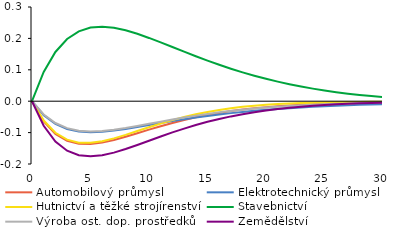
| Category | Automobilový průmysl | Elektrotechnický průmysl | Hutnictví a těžké strojírenství | Stavebnictví | Výroba ost. dop. prostředků | Zemědělství |
|---|---|---|---|---|---|---|
| 0.0 | 0 | 0 | 0 | 0 | 0 | 0 |
| 1.0 | -0.064 | -0.044 | -0.062 | 0.093 | -0.042 | -0.078 |
| 2.0 | -0.104 | -0.072 | -0.101 | 0.157 | -0.07 | -0.128 |
| 3.0 | -0.126 | -0.088 | -0.122 | 0.198 | -0.086 | -0.158 |
| 4.0 | -0.136 | -0.096 | -0.132 | 0.222 | -0.094 | -0.172 |
| 5.0 | -0.137 | -0.099 | -0.133 | 0.234 | -0.096 | -0.176 |
| 6.0 | -0.132 | -0.097 | -0.127 | 0.237 | -0.095 | -0.172 |
| 7.0 | -0.124 | -0.094 | -0.118 | 0.234 | -0.091 | -0.164 |
| 8.0 | -0.113 | -0.088 | -0.107 | 0.226 | -0.085 | -0.152 |
| 9.0 | -0.102 | -0.082 | -0.095 | 0.215 | -0.079 | -0.14 |
| 10.0 | -0.091 | -0.076 | -0.083 | 0.201 | -0.072 | -0.126 |
| 11.0 | -0.08 | -0.069 | -0.071 | 0.187 | -0.065 | -0.112 |
| 12.0 | -0.069 | -0.063 | -0.06 | 0.172 | -0.058 | -0.099 |
| 13.0 | -0.06 | -0.057 | -0.05 | 0.158 | -0.052 | -0.087 |
| 14.0 | -0.051 | -0.052 | -0.042 | 0.143 | -0.046 | -0.076 |
| 15.0 | -0.044 | -0.047 | -0.034 | 0.129 | -0.04 | -0.066 |
| 16.0 | -0.037 | -0.042 | -0.028 | 0.116 | -0.035 | -0.057 |
| 17.0 | -0.032 | -0.038 | -0.022 | 0.104 | -0.031 | -0.048 |
| 18.0 | -0.027 | -0.034 | -0.018 | 0.092 | -0.027 | -0.041 |
| 19.0 | -0.022 | -0.031 | -0.014 | 0.081 | -0.023 | -0.035 |
| 20.0 | -0.019 | -0.028 | -0.011 | 0.071 | -0.02 | -0.03 |
| 21.0 | -0.016 | -0.025 | -0.009 | 0.062 | -0.018 | -0.025 |
| 22.0 | -0.013 | -0.022 | -0.007 | 0.054 | -0.015 | -0.021 |
| 23.0 | -0.011 | -0.02 | -0.006 | 0.047 | -0.013 | -0.018 |
| 24.0 | -0.01 | -0.018 | -0.005 | 0.04 | -0.011 | -0.015 |
| 25.0 | -0.008 | -0.016 | -0.004 | 0.034 | -0.01 | -0.012 |
| 26.0 | -0.007 | -0.014 | -0.003 | 0.029 | -0.008 | -0.01 |
| 27.0 | -0.006 | -0.013 | -0.003 | 0.024 | -0.007 | -0.008 |
| 28.0 | -0.005 | -0.012 | -0.002 | 0.02 | -0.006 | -0.007 |
| 29.0 | -0.004 | -0.01 | -0.002 | 0.016 | -0.005 | -0.006 |
| 30.0 | -0.004 | -0.009 | -0.002 | 0.013 | -0.004 | -0.005 |